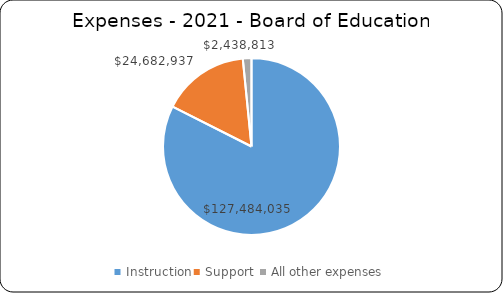
| Category | Series 0 |
|---|---|
| Instruction | 127484035 |
| Support  | 24682937 |
| All other expenses | 2438813 |